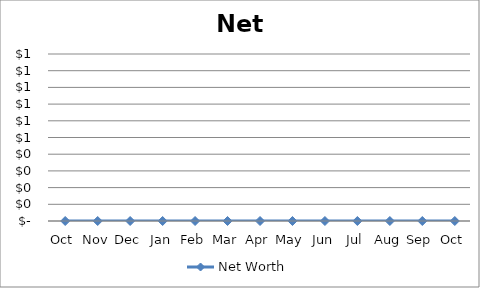
| Category | Net Worth |
|---|---|
| Oct | 0 |
| Nov | 0 |
| Dec | 0 |
| Jan | 0 |
| Feb | 0 |
| Mar | 0 |
| Apr | 0 |
| May | 0 |
| Jun | 0 |
| Jul | 0 |
| Aug | 0 |
| Sep | 0 |
| Oct | 0 |